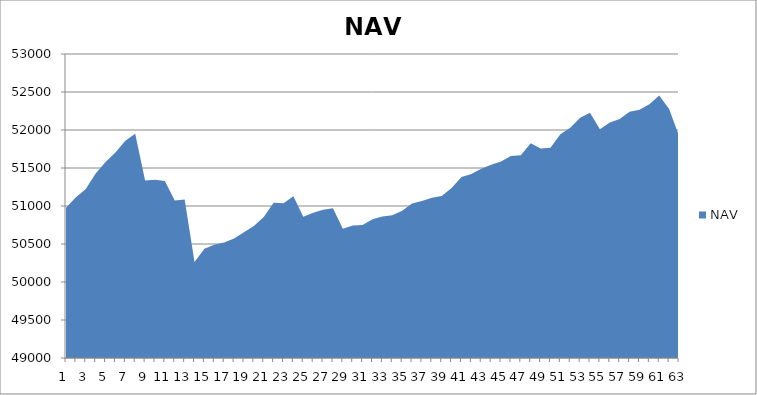
| Category | NAV |
|---|---|
| 0 | 50975.413 |
| 1 | 51115.874 |
| 2 | 51223.542 |
| 3 | 51427.364 |
| 4 | 51580.567 |
| 5 | 51704.692 |
| 6 | 51858.016 |
| 7 | 51951.766 |
| 8 | 51336.067 |
| 9 | 51345.356 |
| 10 | 51328.667 |
| 11 | 51072.985 |
| 12 | 51085.199 |
| 13 | 50261.67 |
| 14 | 50438.394 |
| 15 | 50489.896 |
| 16 | 50518.251 |
| 17 | 50572.468 |
| 18 | 50655.55 |
| 19 | 50737.787 |
| 20 | 50856.035 |
| 21 | 51041.806 |
| 22 | 51034.925 |
| 23 | 51128.589 |
| 24 | 50859.456 |
| 25 | 50911.137 |
| 26 | 50950.007 |
| 27 | 50970.175 |
| 28 | 50701.326 |
| 29 | 50743.495 |
| 30 | 50751.546 |
| 31 | 50826.725 |
| 32 | 50860.533 |
| 33 | 50879.283 |
| 34 | 50936.644 |
| 35 | 51031.381 |
| 36 | 51065.306 |
| 37 | 51109.987 |
| 38 | 51132.251 |
| 39 | 51238.242 |
| 40 | 51380.786 |
| 41 | 51420.042 |
| 42 | 51490.787 |
| 43 | 51541.14 |
| 44 | 51584.924 |
| 45 | 51657.998 |
| 46 | 51667.348 |
| 47 | 51825.763 |
| 48 | 51755.412 |
| 49 | 51767.57 |
| 50 | 51945.15 |
| 51 | 52028.391 |
| 52 | 52160.744 |
| 53 | 52227.009 |
| 54 | 52009.927 |
| 55 | 52099.094 |
| 56 | 52144.26 |
| 57 | 52240.689 |
| 58 | 52266.163 |
| 59 | 52339.405 |
| 60 | 52453.236 |
| 61 | 52275.154 |
| 62 | 51926 |